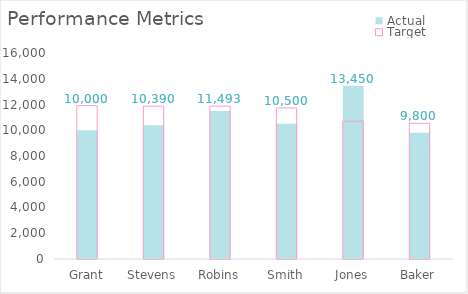
| Category | Actual | Target | Labels |
|---|---|---|---|
| Grant | 10000 | 11909 | 11909 |
| Stevens | 10390 | 11875 | 11875 |
| Robins | 11493 | 11872 | 11872 |
| Smith | 10500 | 11733 | 11733 |
| Jones | 13450 | 10703 | 13450 |
| Baker | 9800 | 10541 | 10541 |